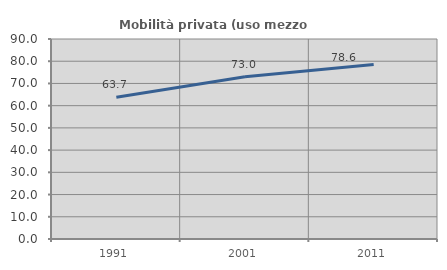
| Category | Mobilità privata (uso mezzo privato) |
|---|---|
| 1991.0 | 63.749 |
| 2001.0 | 73 |
| 2011.0 | 78.552 |